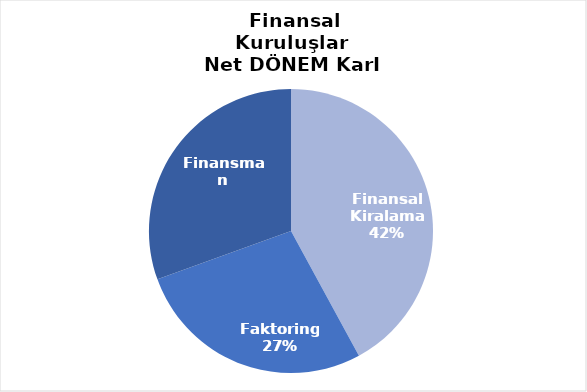
| Category | Series 0 |
|---|---|
| Finansal Kiralama  | 1502 |
| Faktoring  | 979 |
| Finansman | 1090 |